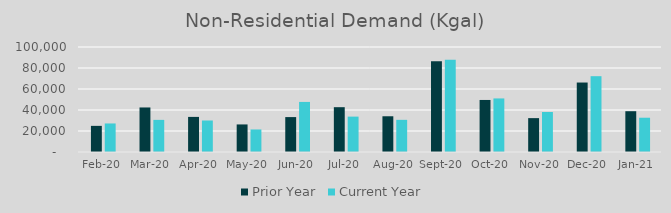
| Category | Prior Year | Current Year |
|---|---|---|
| 2020-02-01 | 24891.705 | 27184.287 |
| 2020-03-01 | 42416.796 | 30591.784 |
| 2020-04-01 | 33427.881 | 30008.586 |
| 2020-05-01 | 26254.448 | 21459.484 |
| 2020-06-01 | 33248.873 | 47687.401 |
| 2020-07-01 | 42679.938 | 33702.696 |
| 2020-08-01 | 34036.498 | 30630.765 |
| 2020-09-01 | 86367.775 | 87939.966 |
| 2020-10-01 | 49561.754 | 51017.647 |
| 2020-11-01 | 32261.42 | 38090.247 |
| 2020-12-01 | 66164.871 | 72201.815 |
| 2021-01-01 | 38851.995 | 32645.301 |